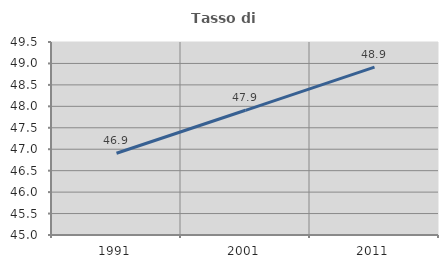
| Category | Tasso di occupazione   |
|---|---|
| 1991.0 | 46.906 |
| 2001.0 | 47.908 |
| 2011.0 | 48.914 |